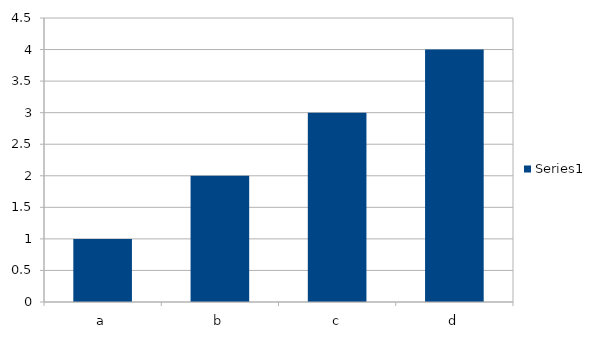
| Category | Series 0 |
|---|---|
| a | 1 |
| b | 2 |
| c | 3 |
| d | 4 |